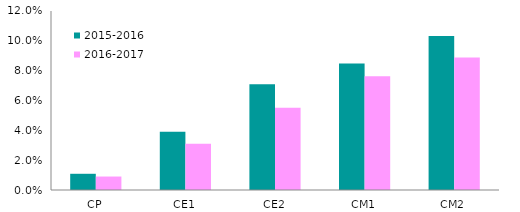
| Category | 2015-2016 | 2016-2017 |
|---|---|---|
| CP | 0.011 | 0.009 |
| CE1 | 0.039 | 0.031 |
| CE2 | 0.071 | 0.055 |
| CM1 | 0.085 | 0.076 |
| CM2 | 0.103 | 0.089 |